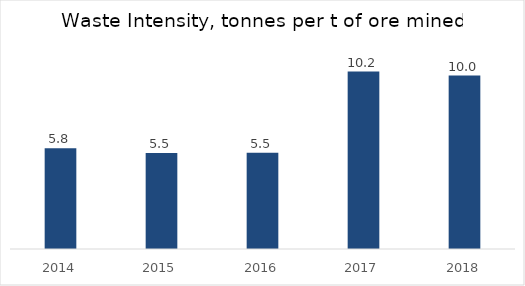
| Category | Series 1 |
|---|---|
| 2014.0 | 5.79 |
| 2015.0 | 5.51 |
| 2016.0 | 5.53 |
| 2017.0 | 10.19 |
| 2018.0 | 9.96 |